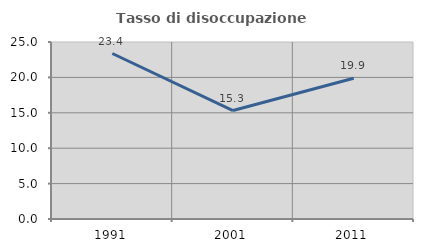
| Category | Tasso di disoccupazione giovanile  |
|---|---|
| 1991.0 | 23.374 |
| 2001.0 | 15.315 |
| 2011.0 | 19.872 |